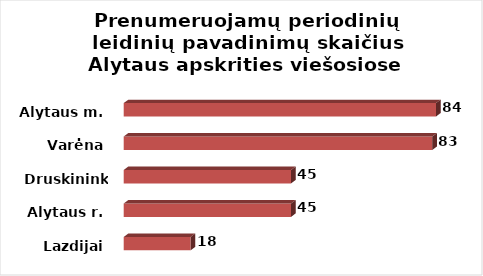
| Category | Series 0 |
|---|---|
| Lazdijai | 18 |
| Alytaus r. | 45 |
| Druskininkai | 45 |
| Varėna | 83 |
| Alytaus m. | 84 |